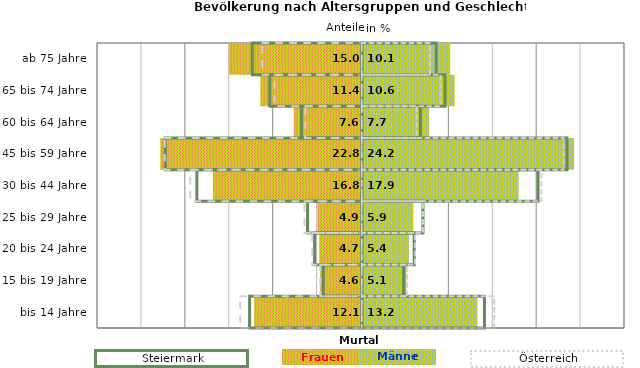
| Category | Frauen | Männer | Frauen Spalte2 | Männer Spalte2 | Frauen Spalte3 | Männer Spalte3 |
|---|---|---|---|---|---|---|
| bis 14 Jahre | -12.1 | 13.2 | 14 | -12.8 | -13.8 | 15.1 |
| 15 bis 19 Jahre | -4.6 | 5.1 | 4.8 | -4.4 | -4.7 | 5.2 |
| 20 bis 24 Jahre | -4.7 | 5.4 | 6 | -5.4 | -5.6 | 6.1 |
| 25 bis 29 Jahre | -4.9 | 5.9 | 7 | -6.2 | -6.5 | 7 |
| 30 bis 44 Jahre | -16.8 | 17.9 | 20.1 | -18.8 | -19.5 | 20.5 |
| 45 bis 59 Jahre | -22.8 | 24.2 | 23.4 | -22.4 | -22.4 | 23 |
| 60 bis 64 Jahre | -7.6 | 7.7 | 6.7 | -6.9 | -6.4 | 6.3 |
| 65 bis 74 Jahre | -11.4 | 10.6 | 9.5 | -10.5 | -9.9 | 9 |
| ab 75 Jahre | -15 | 10.1 | 8.5 | -12.5 | -11.3 | 7.8 |